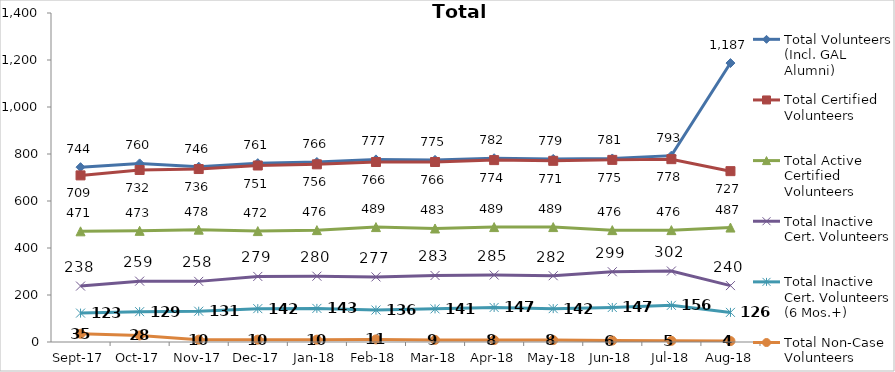
| Category | Total Volunteers (Incl. GAL Alumni) | Total Certified Volunteers | Total Active Certified Volunteers | Total Inactive Cert. Volunteers | Total Inactive Cert. Volunteers (6 Mos.+) | Total Non-Case Volunteers |
|---|---|---|---|---|---|---|
| 2017-09-01 | 744 | 709 | 471 | 238 | 123 | 35 |
| 2017-10-01 | 760 | 732 | 473 | 259 | 129 | 28 |
| 2017-11-01 | 746 | 736 | 478 | 258 | 131 | 10 |
| 2017-12-01 | 761 | 751 | 472 | 279 | 142 | 10 |
| 2018-01-01 | 766 | 756 | 476 | 280 | 143 | 10 |
| 2018-02-01 | 777 | 766 | 489 | 277 | 136 | 11 |
| 2018-03-01 | 775 | 766 | 483 | 283 | 141 | 9 |
| 2018-04-01 | 782 | 774 | 489 | 285 | 147 | 8 |
| 2018-05-01 | 779 | 771 | 489 | 282 | 142 | 8 |
| 2018-06-01 | 781 | 775 | 476 | 299 | 147 | 6 |
| 2018-07-01 | 793 | 778 | 476 | 302 | 156 | 5 |
| 2018-08-01 | 1187 | 727 | 487 | 240 | 126 | 4 |